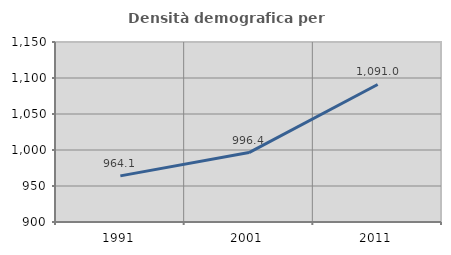
| Category | Densità demografica |
|---|---|
| 1991.0 | 964.08 |
| 2001.0 | 996.439 |
| 2011.0 | 1090.985 |